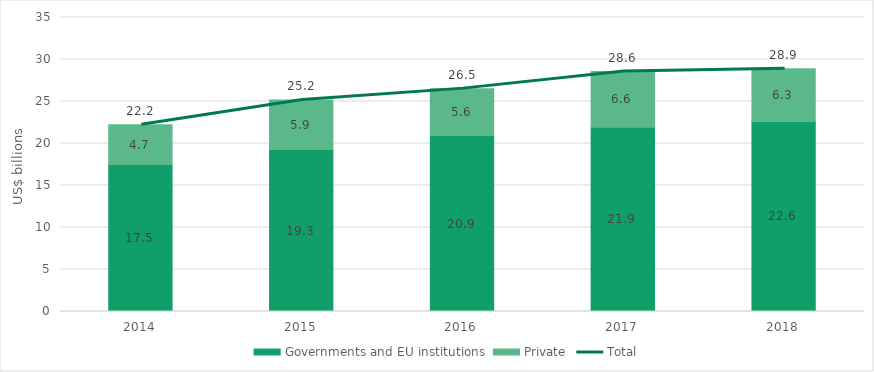
| Category | Governments and EU institutions | Private |
|---|---|---|
| 2014.0 | 17.491 | 4.74 |
| 2015.0 | 19.278 | 5.901 |
| 2016.0 | 20.949 | 5.583 |
| 2017.0 | 21.942 | 6.642 |
| 2018.0 | 22.631 | 6.264 |